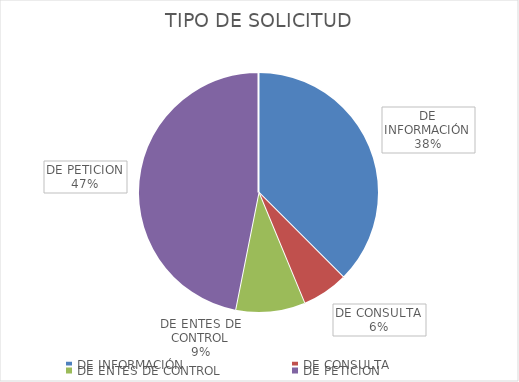
| Category | Series 0 |
|---|---|
| DE INFORMACIÓN | 12 |
| DE CONSULTA | 2 |
| DE ENTES DE CONTROL | 3 |
| DE PETICION | 15 |